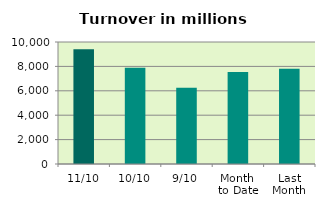
| Category | Series 0 |
|---|---|
| 11/10 | 9406.337 |
| 10/10 | 7891.081 |
| 9/10 | 6250.306 |
| Month 
to Date | 7541.825 |
| Last
Month | 7802.515 |